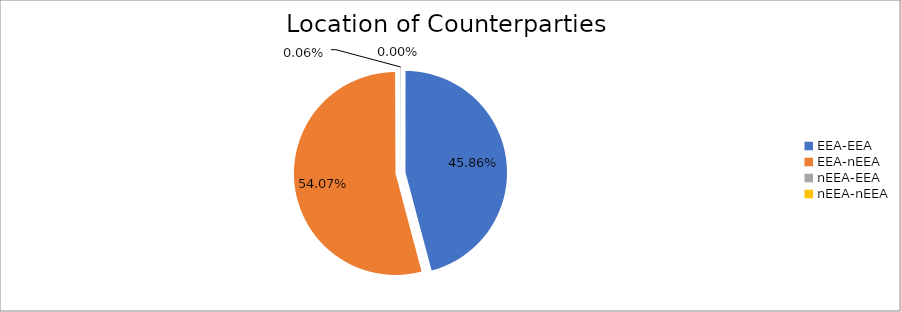
| Category | Series 0 |
|---|---|
| EEA-EEA | 6256571.865 |
| EEA-nEEA | 7376446.559 |
| nEEA-EEA | 8424.048 |
| nEEA-nEEA | 506.646 |